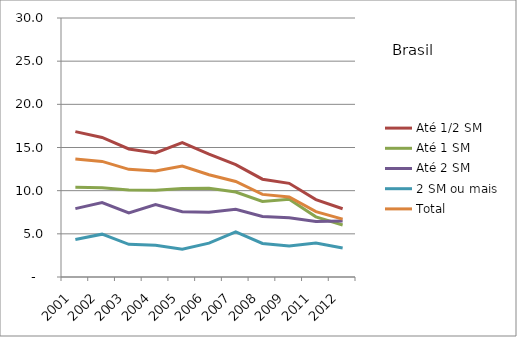
| Category | Até 1/2 SM | Até 1 SM | Até 2 SM | 2 SM ou mais | Total |
|---|---|---|---|---|---|
| 2001.0 | 16.84 | 10.4 | 7.92 | 4.35 | 13.66 |
| 2002.0 | 16.16 | 10.34 | 8.62 | 4.96 | 13.39 |
| 2003.0 | 14.83 | 10.09 | 7.42 | 3.79 | 12.47 |
| 2004.0 | 14.37 | 10.06 | 8.4 | 3.69 | 12.28 |
| 2005.0 | 15.57 | 10.24 | 7.55 | 3.21 | 12.84 |
| 2006.0 | 14.22 | 10.28 | 7.49 | 3.92 | 11.85 |
| 2007.0 | 13.01 | 9.84 | 7.84 | 5.23 | 11.06 |
| 2008.0 | 11.33 | 8.75 | 7.02 | 3.89 | 9.57 |
| 2009.0 | 10.85 | 9 | 6.86 | 3.59 | 9.28 |
| 2011.0 | 8.96 | 6.97 | 6.43 | 3.94 | 7.57 |
| 2012.0 | 7.91 | 6.03 | 6.49 | 3.35 | 6.7 |